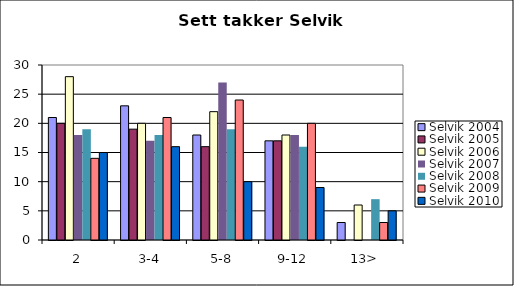
| Category | Selvik 2004 | Selvik 2005 | Selvik 2006 | Selvik 2007 | Selvik 2008 | Selvik 2009 | Selvik 2010 |
|---|---|---|---|---|---|---|---|
| 2 | 21 | 20 | 28 | 18 | 19 | 14 | 15 |
| 3-4 | 23 | 19 | 20 | 17 | 18 | 21 | 16 |
| 5-8 | 18 | 16 | 22 | 27 | 19 | 24 | 10 |
| 9-12 | 17 | 17 | 18 | 18 | 16 | 20 | 9 |
| 13> | 3 | 0 | 6 | 0 | 7 | 3 | 5 |